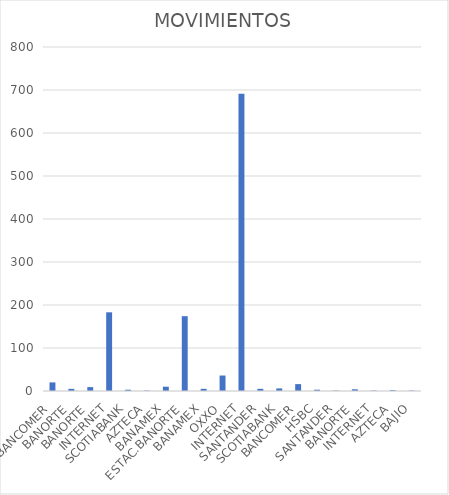
| Category | MOVIMIENTOS |
|---|---|
| BANCOMER | 20 |
| BANORTE | 5 |
| BANORTE | 9 |
| INTERNET | 183 |
| SCOTIABANK | 3 |
| AZTECA | 1 |
| BANAMEX | 10 |
| ESTAC.BANORTE | 174 |
| BANAMEX | 5 |
| OXXO | 36 |
| INTERNET | 691 |
| SANTANDER | 5 |
| SCOTIABANK | 6 |
| BANCOMER | 16 |
| HSBC | 3 |
| SANTANDER | 1 |
| BANORTE | 4 |
| INTERNET | 1 |
| AZTECA | 2 |
| BAJIO | 1 |